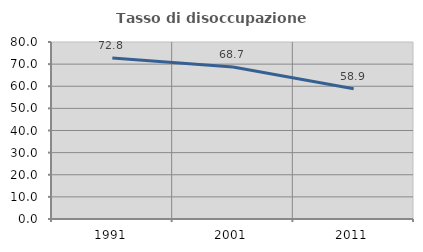
| Category | Tasso di disoccupazione giovanile  |
|---|---|
| 1991.0 | 72.751 |
| 2001.0 | 68.657 |
| 2011.0 | 58.865 |